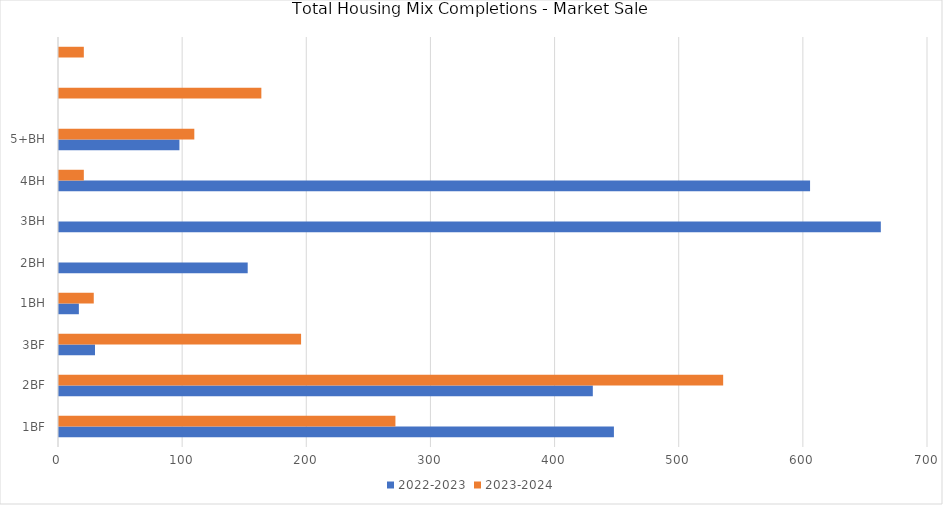
| Category | 2022-2023 | 2023-2024 |
|---|---|---|
| 1BF | 447 | 271 |
| 2BF | 430 | 535 |
| 3BF | 29 | 195 |
| 1BH | 16 | 28 |
| 2BH | 152 | 0 |
| 3BH | 662 | 0 |
| 4BH | 605 | 20 |
| 5+BH | 97 | 109 |